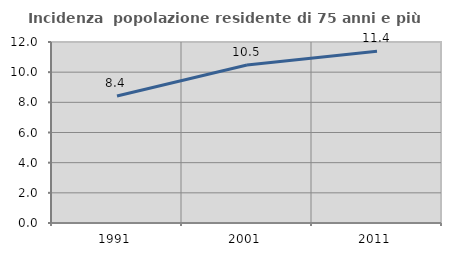
| Category | Incidenza  popolazione residente di 75 anni e più |
|---|---|
| 1991.0 | 8.422 |
| 2001.0 | 10.473 |
| 2011.0 | 11.385 |